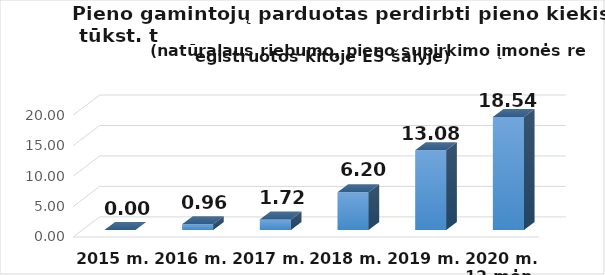
| Category | Kitoje ES šalyje registruotam ūkio subjektui  |
|---|---|
| 2015 m. | 0 |
| 2016 m. | 0.96 |
| 2017 m.  | 1.72 |
| 2018 m.  | 6.2 |
| 2019 m.  | 13.08 |
| 2020 m. 12 mėn. | 18.54 |